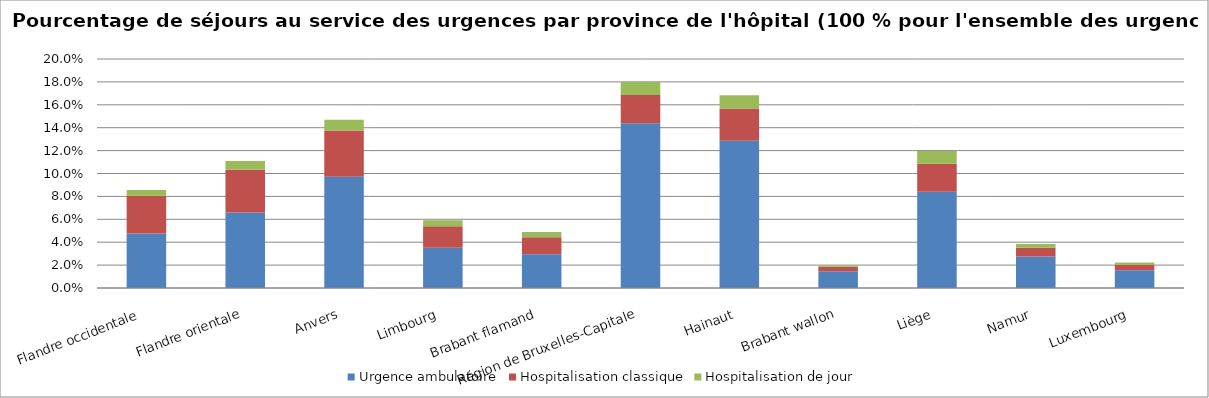
| Category | Urgence ambulatoire | Hospitalisation classique | Hospitalisation de jour |
|---|---|---|---|
| Flandre occidentale | 0.048 | 0.033 | 0.005 |
| Flandre orientale | 0.066 | 0.037 | 0.008 |
| Anvers | 0.097 | 0.04 | 0.009 |
| Limbourg | 0.035 | 0.019 | 0.005 |
| Brabant flamand | 0.029 | 0.015 | 0.004 |
| Région de Bruxelles-Capitale | 0.144 | 0.025 | 0.011 |
| Hainaut | 0.129 | 0.028 | 0.012 |
| Brabant wallon | 0.015 | 0.004 | 0.001 |
| Liège | 0.084 | 0.025 | 0.011 |
| Namur | 0.027 | 0.008 | 0.003 |
| Luxembourg | 0.016 | 0.005 | 0.002 |